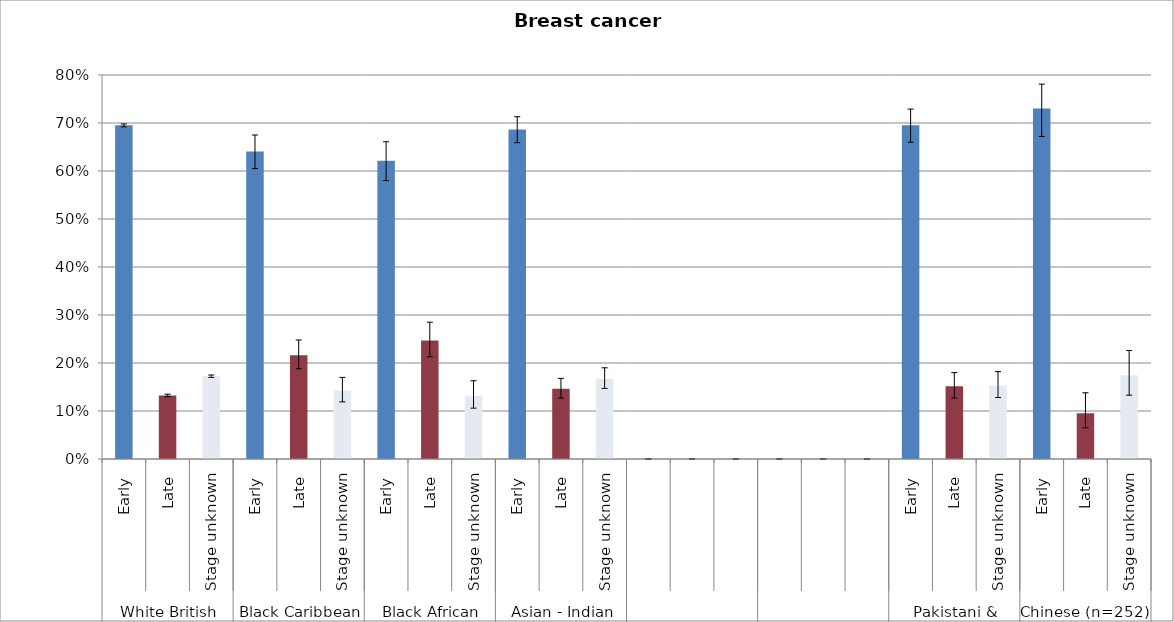
| Category | Early |
|---|---|
| 0 | 0.695 |
| 1 | 0.132 |
| 2 | 0.173 |
| 3 | 0.641 |
| 4 | 0.216 |
| 5 | 0.143 |
| 6 | 0.622 |
| 7 | 0.247 |
| 8 | 0.132 |
| 9 | 0.686 |
| 10 | 0.146 |
| 11 | 0.167 |
| 12 | 0 |
| 13 | 0 |
| 14 | 0 |
| 15 | 0 |
| 16 | 0 |
| 17 | 0 |
| 18 | 0.695 |
| 19 | 0.152 |
| 20 | 0.153 |
| 21 | 0.73 |
| 22 | 0.095 |
| 23 | 0.175 |